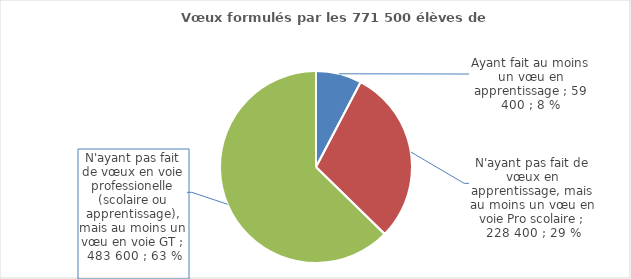
| Category | 2019 |
|---|---|
| Ayant fait au moins un vœu en apprentissage | 59400 |
| N'ayant pas fait de vœux en apprentissage, mais au moins un vœu en voie PRO scolaire | 228400 |
| N'ayant pas fait de vœux en voie pro (sco ou app), mais au moins un vœu en voie GT | 483600 |